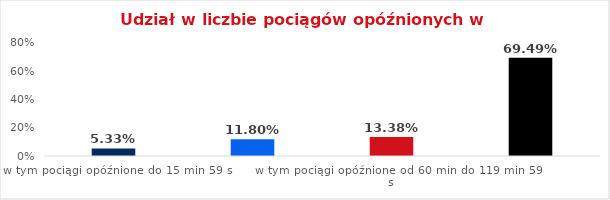
| Category | Series 0 |
|---|---|
| w tym pociągi opóźnione do 15 min 59 s | 0.053 |
| w tym pociągi opóźnione od 16 min do 59 min 59 s | 0.118 |
| w tym pociągi opóźnione od 60 min do 119 min 59 s | 0.134 |
| w tym pociągi opóźnione od 120 min | 0.695 |